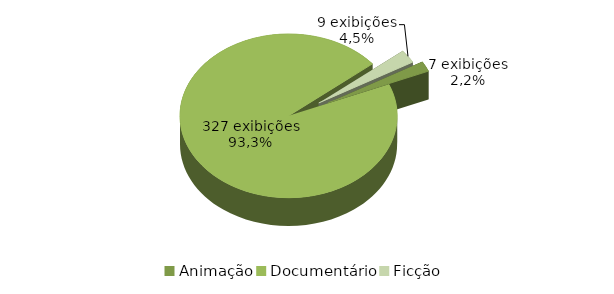
| Category | Brasileira |
|---|---|
| Animação | 7 |
| Documentário | 327 |
| Ficção | 9 |